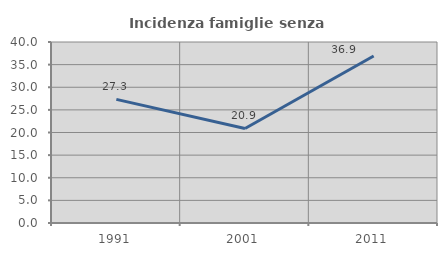
| Category | Incidenza famiglie senza nuclei |
|---|---|
| 1991.0 | 27.323 |
| 2001.0 | 20.894 |
| 2011.0 | 36.9 |